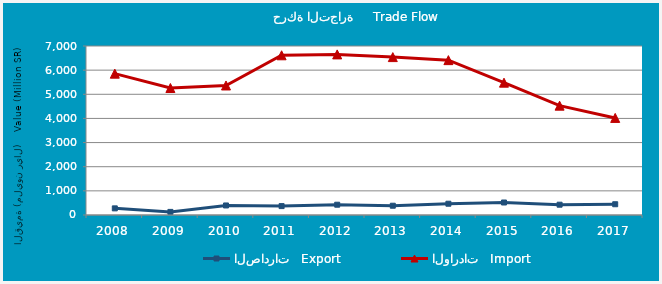
| Category | الصادرات   Export | الواردات   Import |
|---|---|---|
| 2008.0 | 274741441 | 5853899641 |
| 2009.0 | 128349818 | 5260864154 |
| 2010.0 | 395137704 | 5364956127 |
| 2011.0 | 368854503 | 6615423795 |
| 2012.0 | 426309212 | 6652091046 |
| 2013.0 | 384368720 | 6540059178 |
| 2014.0 | 467042438 | 6414786538 |
| 2015.0 | 517156907 | 5481468965 |
| 2016.0 | 426690469 | 4528798752 |
| 2017.0 | 445726989 | 4021328281 |